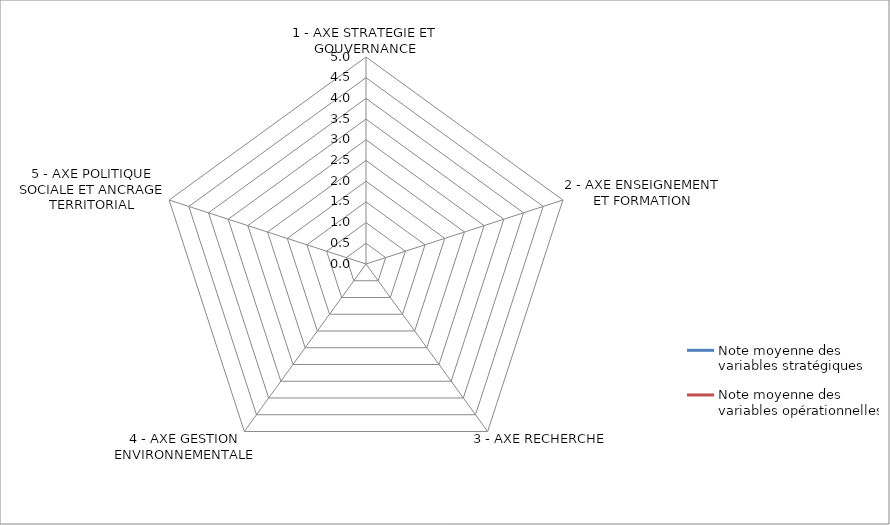
| Category | Note moyenne des variables stratégiques | Note moyenne des variables opérationnelles |
|---|---|---|
| 1 - AXE STRATEGIE ET GOUVERNANCE | 0 | 0 |
| 2 - AXE ENSEIGNEMENT ET FORMATION | 0 | 0 |
| 3 - AXE RECHERCHE | 0 | 0 |
| 4 - AXE GESTION ENVIRONNEMENTALE | 0 | 0 |
| 5 - AXE POLITIQUE SOCIALE ET ANCRAGE TERRITORIAL | 0 | 0 |